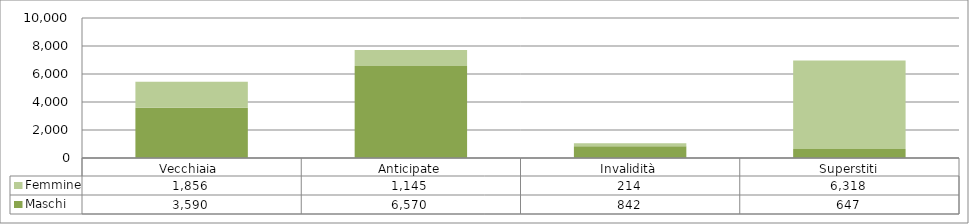
| Category | Maschi | Femmine |
|---|---|---|
| Vecchiaia  | 3590 | 1856 |
| Anticipate | 6570 | 1145 |
| Invalidità | 842 | 214 |
| Superstiti | 647 | 6318 |